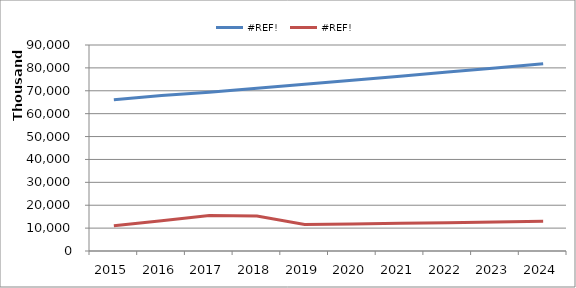
| Category | #REF! |
|---|---|
| 2015.0 | 11068917 |
| 2016.0 | 13222617 |
| 2017.0 | 15498842 |
| 2018.0 | 15273813 |
| 2019.0 | 11544385 |
| 2020.0 | 11821450 |
| 2021.0 | 12105165 |
| 2022.0 | 12395689 |
| 2023.0 | 12680790 |
| 2024.0 | 12972448 |